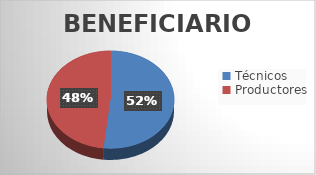
| Category | Series 0 |
|---|---|
| Técnicos | 89 |
| Productores | 83 |